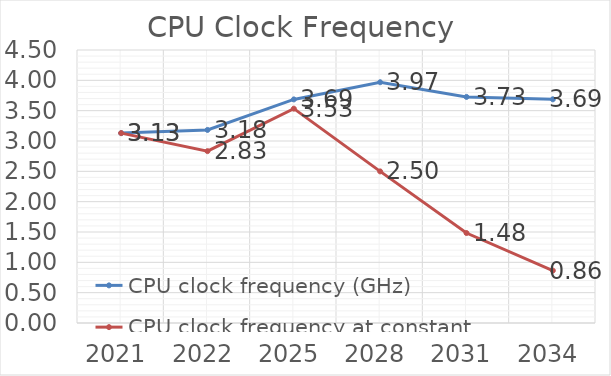
| Category | CPU clock frequency (GHz) | CPU clock frequency at constant power density (GHz) |
|---|---|---|
| 2021.0 | 3.13 | 3.13 |
| 2022.0 | 3.182 | 2.833 |
| 2025.0 | 3.686 | 3.533 |
| 2028.0 | 3.969 | 2.499 |
| 2031.0 | 3.727 | 1.483 |
| 2034.0 | 3.687 | 0.864 |